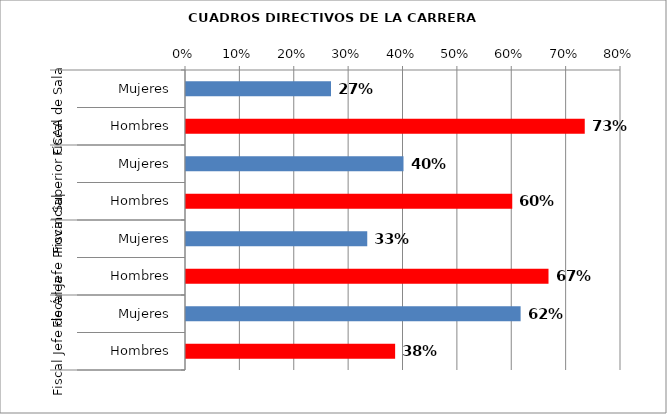
| Category | Series 0 |
|---|---|
| 0 | 0.267 |
| 1 | 0.733 |
| 2 | 0.4 |
| 3 | 0.6 |
| 4 | 0.333 |
| 5 | 0.667 |
| 6 | 0.615 |
| 7 | 0.385 |